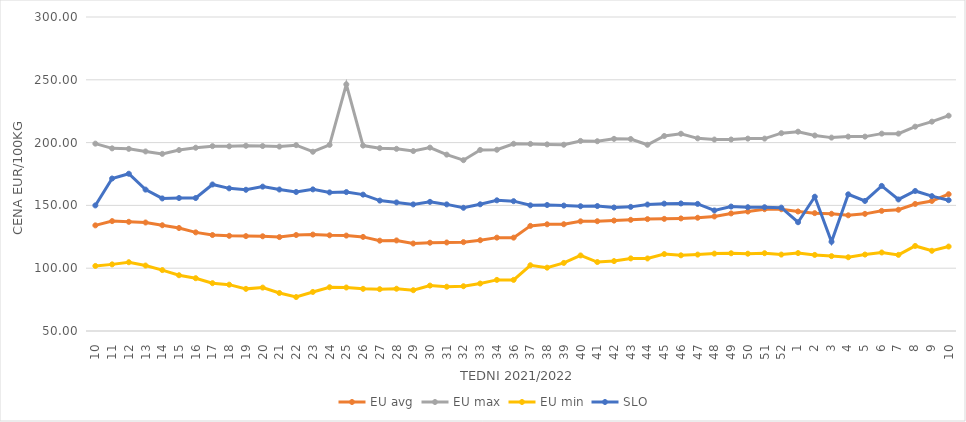
| Category | EU avg | EU max | EU min | SLO |
|---|---|---|---|---|
| 10.0 | 134.098 | 199.17 | 101.79 | 149.98 |
| 11.0 | 137.49 | 195.419 | 103.05 | 171.4 |
| 12.0 | 136.929 | 195.013 | 104.76 | 175.2 |
| 13.0 | 136.39 | 192.952 | 102.11 | 162.57 |
| 14.0 | 134.198 | 191.034 | 98.5 | 155.55 |
| 15.0 | 132.003 | 194.047 | 94.39 | 155.88 |
| 16.0 | 128.53 | 195.913 | 92.04 | 155.88 |
| 17.0 | 126.415 | 197.188 | 88.07 | 166.66 |
| 18.0 | 125.787 | 197.055 | 86.89 | 163.58 |
| 19.0 | 125.54 | 197.478 | 83.546 | 162.44 |
| 20.0 | 125.412 | 197.263 | 84.55 | 164.94 |
| 21.0 | 124.768 | 196.821 | 80.264 | 162.64 |
| 22.0 | 126.43 | 197.963 | 77.048 | 160.68 |
| 23.0 | 126.76 | 192.72 | 81.087 | 162.75 |
| 24.0 | 126.19 | 198.186 | 84.83 | 160.34 |
| 25.0 | 125.97 | 246.36 | 84.63 | 160.6 |
| 26.0 | 124.92 | 197.607 | 83.57 | 158.57 |
| 27.0 | 121.922 | 195.566 | 83.3 | 153.83 |
| 28.0 | 122.106 | 195.043 | 83.64 | 152.35 |
| 29.0 | 119.659 | 193.272 | 82.49 | 150.79 |
| 30.0 | 120.3 | 196.01 | 86.16 | 152.82 |
| 31.0 | 120.473 | 190.42 | 85.26 | 150.8 |
| 32.0 | 120.756 | 186 | 85.65 | 148.1 |
| 33.0 | 122.274 | 194.145 | 87.8 | 150.88 |
| 34.0 | 124.332 | 194.304 | 90.69 | 154.04 |
| 36.0 | 124.332 | 199.06 | 90.69 | 153.37 |
| 37.0 | 133.685 | 198.97 | 102.334 | 150.06 |
| 38.0 | 134.959 | 198.57 | 100.43 | 150.32 |
| 39.0 | 135.021 | 198.3 | 104.21 | 149.86 |
| 40.0 | 137.315 | 201.34 | 110.15 | 149.34 |
| 41.0 | 137.411 | 201.081 | 104.9 | 149.48 |
| 42.0 | 137.908 | 202.98 | 105.65 | 148.32 |
| 43.0 | 138.52 | 202.856 | 107.8 | 148.83 |
| 44.0 | 139.076 | 198.26 | 107.75 | 150.69 |
| 45.0 | 139.275 | 205.257 | 111.25 | 151.41 |
| 46.0 | 139.626 | 207.046 | 110.26 | 151.56 |
| 47.0 | 140.17 | 203.387 | 110.83 | 151.2 |
| 48.0 | 141.2 | 202.42 | 111.62 | 145.97 |
| 49.0 | 143.614 | 202.45 | 111.89 | 149.07 |
| 50.0 | 145.101 | 203.17 | 111.54 | 148.55 |
| 51.0 | 146.984 | 203.17 | 111.93 | 148.54 |
| 52.0 | 146.958 | 207.5 | 110.85 | 148.22 |
| 1.0 | 145.157 | 208.7 | 112.04 | 136.59 |
| 2.0 | 143.842 | 205.67 | 110.59 | 156.88 |
| 3.0 | 143.324 | 203.97 | 109.62 | 121.07 |
| 4.0 | 142.105 | 204.76 | 108.71 | 158.82 |
| 5.0 | 143.269 | 204.76 | 110.86 | 153.55 |
| 6.0 | 145.648 | 207.14 | 112.52 | 165.51 |
| 7.0 | 146.545 | 207.14 | 110.619 | 154.74 |
| 8.0 | 151.148 | 212.7 | 117.709 | 161.48 |
| 9.0 | 153.546 | 216.67 | 113.871 | 157.38 |
| 10.0 | 158.898 | 221.43 | 117.233 | 154.16 |